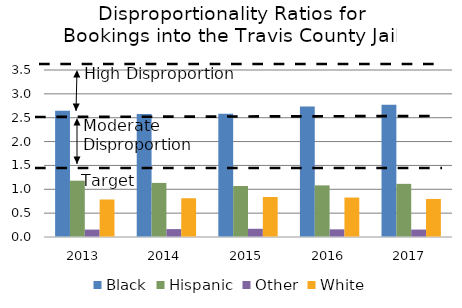
| Category | Black | Hispanic | Other | White |
|---|---|---|---|---|
| 2013.0 | 2.648 | 1.18 | 0.155 | 0.786 |
| 2014.0 | 2.576 | 1.134 | 0.165 | 0.812 |
| 2015.0 | 2.583 | 1.069 | 0.172 | 0.839 |
| 2016.0 | 2.737 | 1.082 | 0.161 | 0.827 |
| 2017.0 | 2.773 | 1.114 | 0.156 | 0.798 |